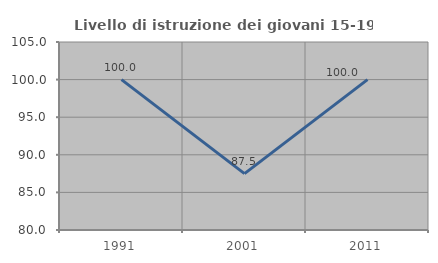
| Category | Livello di istruzione dei giovani 15-19 anni |
|---|---|
| 1991.0 | 100 |
| 2001.0 | 87.5 |
| 2011.0 | 100 |